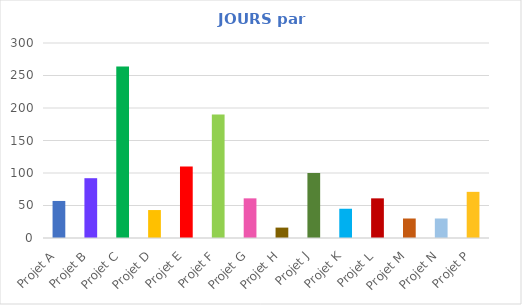
| Category | NO. DE JOURS |
|---|---|
| Projet A | 57 |
| Projet B | 92 |
| Projet C | 264 |
| Projet D | 43 |
| Projet E | 110 |
| Projet F | 190 |
| Projet G | 61 |
| Projet H | 16 |
| Projet J | 100 |
| Projet K | 45 |
| Projet L | 61 |
| Projet M | 30 |
| Projet N | 30 |
| Projet P | 71 |